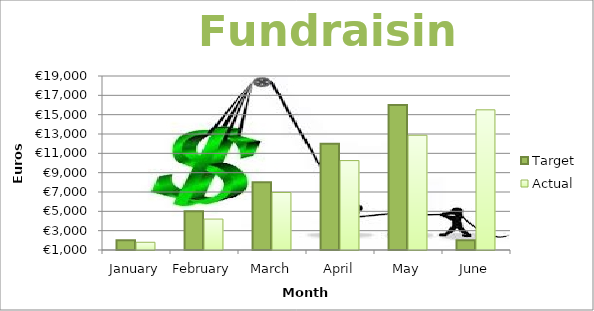
| Category | Target | Actual |
|---|---|---|
| January | 2000 | 1800 |
| February | 5000 | 4200 |
| March | 8000 | 6950 |
| April | 12000 | 10250 |
| May | 16000 | 12870 |
| June | 2000 | 15500 |